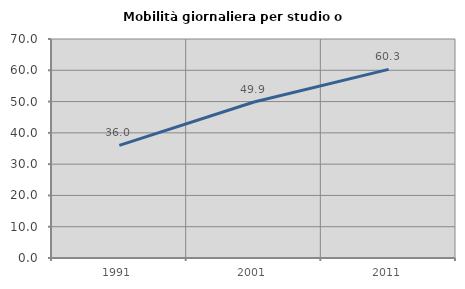
| Category | Mobilità giornaliera per studio o lavoro |
|---|---|
| 1991.0 | 35.986 |
| 2001.0 | 49.866 |
| 2011.0 | 60.3 |